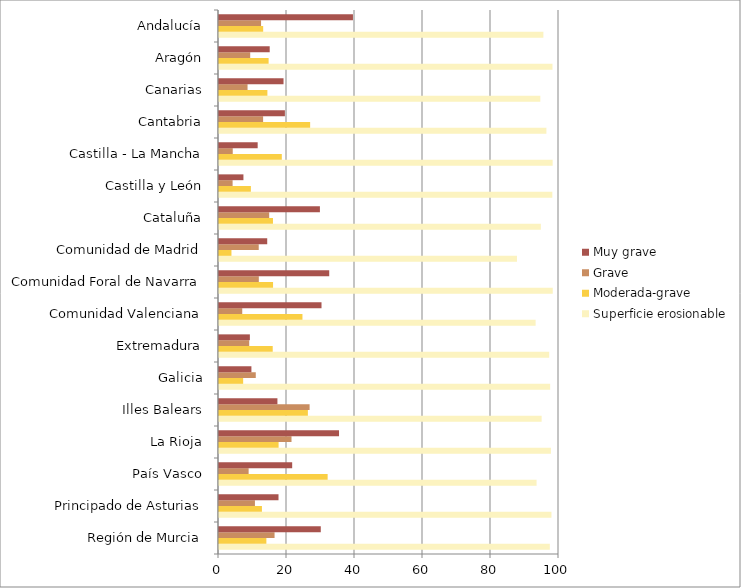
| Category | Superficie erosionable | Moderada-grave | Grave | Muy grave |
|---|---|---|---|---|
| Región de Murcia | 97.301 | 13.934 | 16.341 | 29.936 |
| Principado de Asturias | 97.778 | 12.625 | 10.57 | 17.503 |
| País Vasco | 93.405 | 31.954 | 8.715 | 21.523 |
| La Rioja | 97.617 | 17.531 | 21.326 | 35.3 |
| Illes Balears | 94.89 | 26.141 | 26.649 | 17.184 |
| Galicia | 97.391 | 7.107 | 10.815 | 9.533 |
| Extremadura | 97.12 | 15.801 | 8.886 | 9.08 |
| Comunidad Valenciana | 93.125 | 24.545 | 6.837 | 30.151 |
| Comunidad Foral de Navarra | 98.159 | 15.896 | 11.71 | 32.42 |
| Comunidad de Madrid | 87.635 | 3.664 | 11.685 | 14.181 |
| Cataluña | 94.663 | 15.875 | 14.762 | 29.68 |
| Castilla y León | 98.04 | 9.379 | 4.001 | 7.187 |
| Castilla - La Mancha | 98.133 | 18.473 | 4.042 | 11.374 |
| Cantabria | 96.292 | 26.809 | 12.974 | 19.383 |
| Canarias | 94.502 | 14.233 | 8.398 | 18.98 |
| Aragón | 98.081 | 14.592 | 9.178 | 14.915 |
| Andalucía | 95.404 | 12.994 | 12.371 | 39.399 |